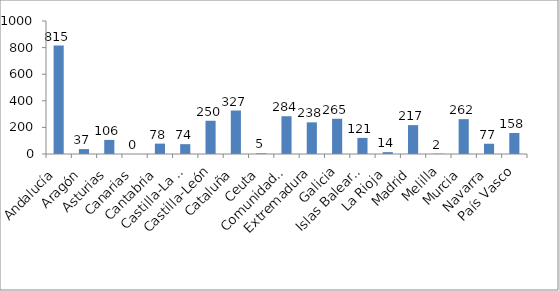
| Category | Series 0 |
|---|---|
| Andalucía | 815 |
| Aragón | 37 |
| Asturias | 106 |
| Canarias | 0 |
| Cantabria | 78 |
| Castilla-La Mancha | 74 |
| Castilla-León | 250 |
| Cataluña | 327 |
| Ceuta | 5 |
| Comunidad Valenciana | 284 |
| Extremadura | 238 |
| Galicia | 265 |
| Islas Baleares | 121 |
| La Rioja | 14 |
| Madrid | 217 |
| Melilla | 2 |
| Murcia | 262 |
| Navarra | 77 |
| País Vasco | 158 |